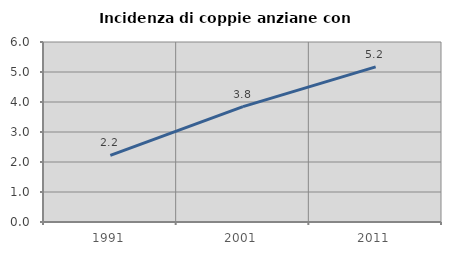
| Category | Incidenza di coppie anziane con figli |
|---|---|
| 1991.0 | 2.222 |
| 2001.0 | 3.846 |
| 2011.0 | 5.172 |